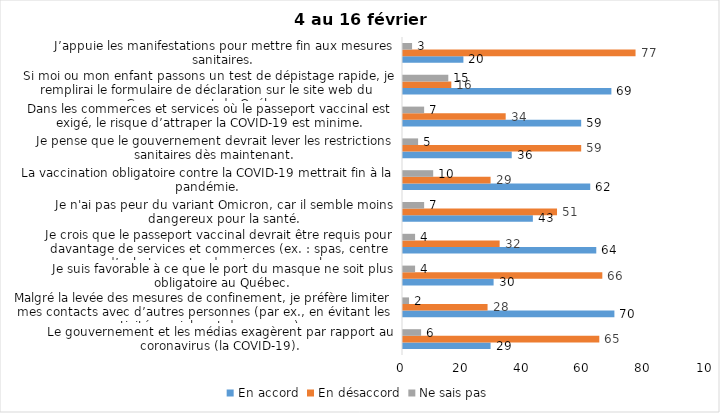
| Category | En accord | En désaccord | Ne sais pas |
|---|---|---|---|
| Le gouvernement et les médias exagèrent par rapport au coronavirus (la COVID-19). | 29 | 65 | 6 |
| Malgré la levée des mesures de confinement, je préfère limiter mes contacts avec d’autres personnes (par ex., en évitant les activités sociales et de groupes) | 70 | 28 | 2 |
| Je suis favorable à ce que le port du masque ne soit plus obligatoire au Québec. | 30 | 66 | 4 |
| Je crois que le passeport vaccinal devrait être requis pour davantage de services et commerces (ex. : spas, centre d’achats, centre de soins personnels. | 64 | 32 | 4 |
| Je n'ai pas peur du variant Omicron, car il semble moins dangereux pour la santé. | 43 | 51 | 7 |
| La vaccination obligatoire contre la COVID-19 mettrait fin à la pandémie. | 62 | 29 | 10 |
| Je pense que le gouvernement devrait lever les restrictions sanitaires dès maintenant. | 36 | 59 | 5 |
| Dans les commerces et services où le passeport vaccinal est exigé, le risque d’attraper la COVID-19 est minime. | 59 | 34 | 7 |
| Si moi ou mon enfant passons un test de dépistage rapide, je remplirai le formulaire de déclaration sur le site web du Gouvernement du Québec. | 69 | 16 | 15 |
| J’appuie les manifestations pour mettre fin aux mesures sanitaires. | 20 | 77 | 3 |